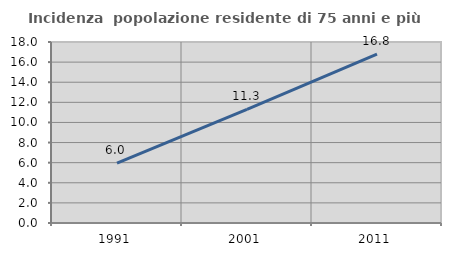
| Category | Incidenza  popolazione residente di 75 anni e più |
|---|---|
| 1991.0 | 5.961 |
| 2001.0 | 11.293 |
| 2011.0 | 16.799 |